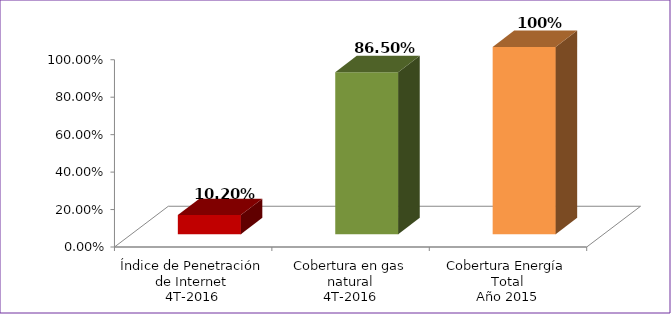
| Category | Series 0 |
|---|---|
| Índice de Penetración de Internet
4T-2016 | 0.102 |
| Cobertura en gas natural
4T-2016 | 0.865 |
| Cobertura Energía Total
Año 2015 | 1 |